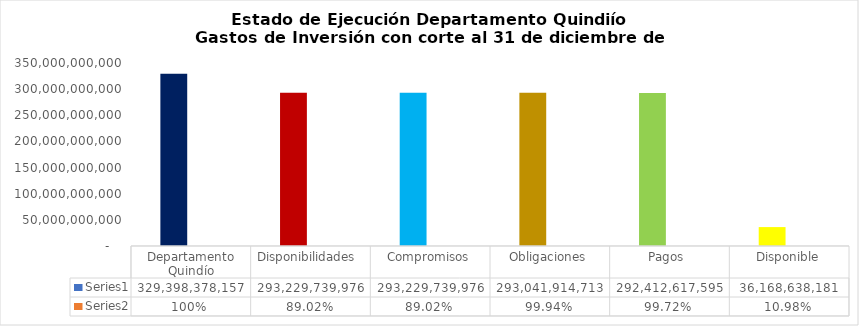
| Category | Series 0 | Series 1 |
|---|---|---|
| Departamento Quindío | 329398378156.88 | 1 |
| Disponibilidades  | 293229739975.744 | 0.89 |
| Compromisos | 293229739975.774 | 0.89 |
| Obligaciones | 293041914712.842 | 0.999 |
| Pagos  | 292412617594.842 | 0.997 |
| Disponible | 36168638181.136 | 0.11 |